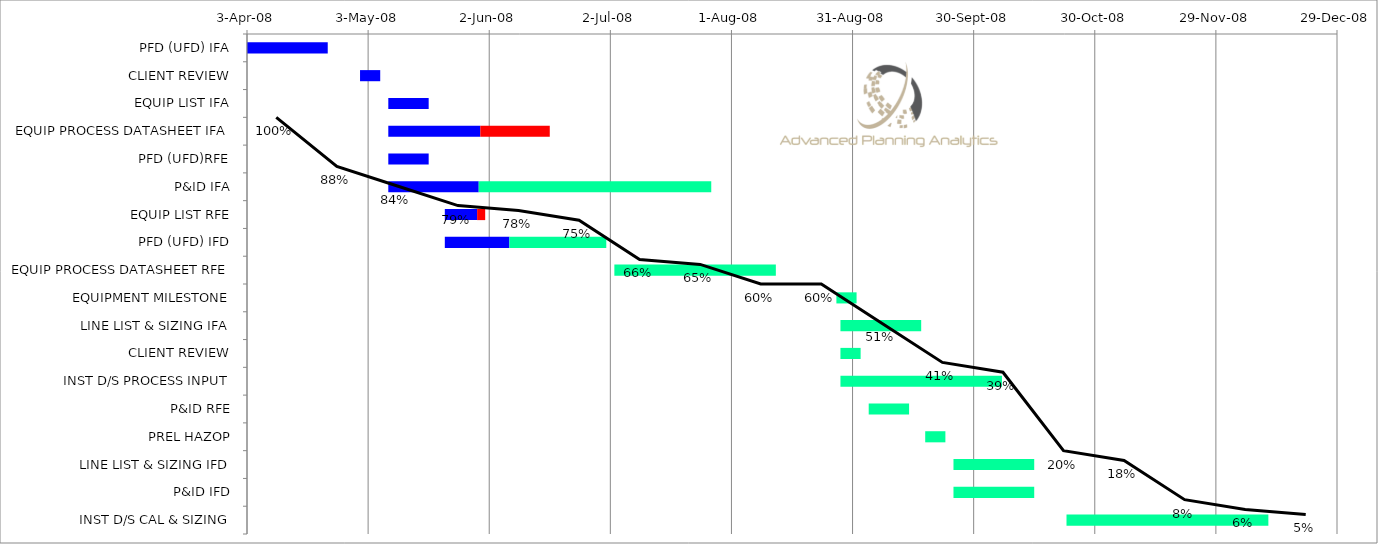
| Category | Start | Series 1 | Remaining |
|---|---|---|---|
| PFD (UFD) IFA | 2008-04-03 | 20 | 0 |
| CLIENT REVIEW | 2008-05-01 | 5 | 0 |
| EQUIP LIST IFA | 2008-05-08 | 10 | 0 |
| EQUIP PROCESS DATASHEET IFA | 2008-05-08 | 22.8 | 17.2 |
| PFD (UFD)RFE | 2008-05-08 | 10 | 0 |
| P&ID IFA | 2008-05-08 | 22.4 | 57.6 |
| EQUIP LIST RFE | 2008-05-22 | 8 | 2 |
| PFD (UFD) IFD | 2008-05-22 | 16 | 24 |
| EQUIP PROCESS DATASHEET RFE | 2008-07-03 | 0 | 40 |
| EQUIPMENT MILESTONE | 2008-08-27 | 0 | 5 |
| LINE LIST & SIZING IFA | 2008-08-28 | 0 | 20 |
| CLIENT REVIEW | 2008-08-28 | 0 | 5 |
| INST D/S PROCESS INPUT | 2008-08-28 | 0 | 40 |
| P&ID RFE | 2008-09-04 | 0 | 10 |
| PREL HAZOP | 2008-09-18 | 0 | 5 |
| LINE LIST & SIZING IFD | 2008-09-25 | 0 | 20 |
| P&ID IFD | 2008-09-25 | 0 | 20 |
| INST D/S CAL & SIZING | 2008-10-23 | 0 | 50 |